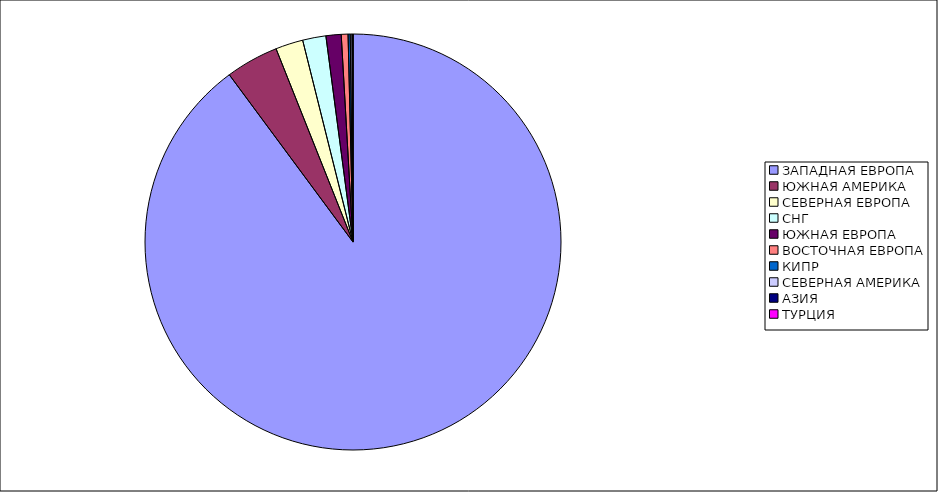
| Category | Оборот |
|---|---|
| ЗАПАДНАЯ ЕВРОПА | 0.899 |
| ЮЖНАЯ АМЕРИКА | 0.041 |
| СЕВЕРНАЯ ЕВРОПА | 0.021 |
| СНГ | 0.018 |
| ЮЖНАЯ ЕВРОПА | 0.012 |
| ВОСТОЧНАЯ ЕВРОПА | 0.005 |
| КИПР | 0.002 |
| СЕВЕРНАЯ АМЕРИКА | 0.001 |
| АЗИЯ | 0.001 |
| ТУРЦИЯ | 0 |